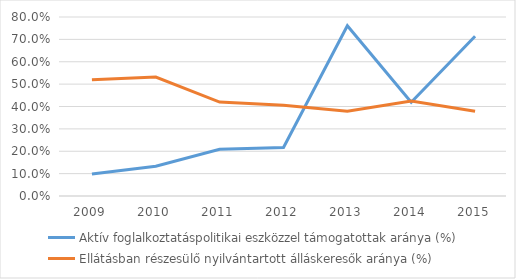
| Category | Aktív foglalkoztatáspolitikai eszközzel támogatottak aránya (%) | Ellátásban részesülő nyilvántartott álláskeresők aránya (%) |
|---|---|---|
| 2009.0 | 0.098 | 0.519 |
| 2010.0 | 0.133 | 0.532 |
| 2011.0 | 0.209 | 0.42 |
| 2012.0 | 0.217 | 0.405 |
| 2013.0 | 0.761 | 0.379 |
| 2014.0 | 0.419 | 0.424 |
| 2015.0 | 0.714 | 0.379 |